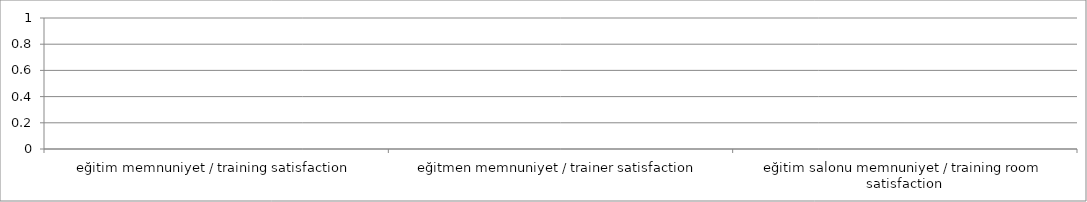
| Category | Series 0 | Series 1 |
|---|---|---|
| eğitim memnuniyet / training satisfaction |  | 0 |
| eğitmen memnuniyet / trainer satisfaction |  | 0 |
| eğitim salonu memnuniyet / training room satisfaction |  | 0 |